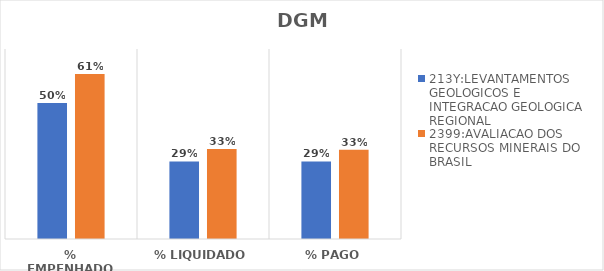
| Category | 213Y:LEVANTAMENTOS GEOLOGICOS E INTEGRACAO GEOLOGICA REGIONAL | 2399:AVALIACAO DOS RECURSOS MINERAIS DO BRASIL |
|---|---|---|
| % EMPENHADO | 0.501 | 0.608 |
| % LIQUIDADO | 0.286 | 0.332 |
| % PAGO | 0.286 | 0.329 |